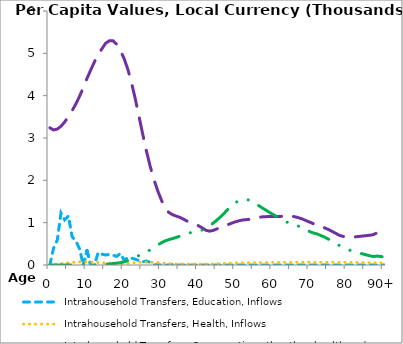
| Category | Intrahousehold Transfers, Education, Inflows | Intrahousehold Transfers, Health, Inflows | Intrahousehold Transfers, Consumption other than health and education, Inflows | Intrahousehold Transfers, Saving, Inflows |
|---|---|---|---|---|
| 0 | 0 | 0 | 3240.183 | 0 |
|  | 398.568 | 0 | 3190.546 | 0 |
| 2 | 589.279 | 17.185 | 3210.608 | 0 |
| 3 | 1228.678 | 32.034 | 3278.168 | 0 |
| 4 | 1067.011 | 43.698 | 3379.369 | 0 |
| 5 | 1159.666 | 52.711 | 3509.063 | 0 |
| 6 | 667.687 | 61.081 | 3647.013 | 0 |
| 7 | 567.62 | 68.461 | 3805.423 | 0 |
| 8 | 381.878 | 74.679 | 3984.844 | 0 |
| 9 | 0 | 78.019 | 4188.758 | 0 |
| 10 | 338.754 | 73.393 | 4408.093 | 0 |
| 11 | 0 | 67.792 | 4605.565 | 0.593 |
| 12 | 0 | 64.281 | 4798.766 | 4.177 |
| 13 | 294.288 | 59.221 | 4967.651 | 7.796 |
| 14 | 255.62 | 53.551 | 5105.435 | 11.478 |
| 15 | 236.878 | 48.256 | 5236.646 | 17.678 |
| 16 | 249.997 | 44.399 | 5295.285 | 25.417 |
| 17 | 230.655 | 40.732 | 5296.073 | 34.45 |
| 18 | 204.538 | 37.234 | 5214.381 | 43.744 |
| 19 | 272.016 | 35.946 | 5061.408 | 55.609 |
| 20 | 114.3 | 36.479 | 4875.232 | 75.746 |
| 21 | 173.171 | 40.791 | 4620.135 | 103.928 |
| 22 | 162.661 | 48.712 | 4299.49 | 139.117 |
| 23 | 137.656 | 56.892 | 3923.121 | 181.134 |
| 24 | 102.79 | 63.363 | 3511.034 | 225.829 |
| 25 | 71.088 | 66.055 | 3091.244 | 269.579 |
| 26 | 94.882 | 66.097 | 2692.379 | 310.72 |
| 27 | 60.508 | 65.006 | 2335.058 | 356.426 |
| 28 | 1.106 | 62.451 | 2024.441 | 410.749 |
| 29 | 11.4 | 57.857 | 1762.796 | 468.936 |
| 30 | 0 | 50.732 | 1538.939 | 523.926 |
| 31 | 0 | 42.04 | 1355.143 | 568.493 |
| 32 | 0 | 34.995 | 1242.11 | 597.828 |
| 33 | 9.634 | 30.434 | 1189.642 | 623.414 |
| 34 | 0 | 27.495 | 1156.168 | 651.304 |
| 35 | 0 | 25.983 | 1124.263 | 679.855 |
| 36 | 0 | 24.747 | 1081.108 | 708.552 |
| 37 | 1.085 | 23.305 | 1034.434 | 738.918 |
| 38 | 0 | 22.2 | 997.449 | 767.445 |
| 39 | 0 | 21.777 | 968.028 | 788.655 |
| 40 | 0 | 21.922 | 927.325 | 803.031 |
| 41 | 0 | 22.716 | 878.094 | 824.99 |
| 42 | 0 | 23.409 | 820.286 | 868.692 |
| 43 | 0 | 24.751 | 799.834 | 923.664 |
| 44 | 0 | 27.133 | 817.931 | 991.211 |
| 45 | 0 | 30.143 | 853.794 | 1062.618 |
| 46 | 0 | 33.889 | 887.219 | 1141.699 |
| 47 | 0 | 38.224 | 919.74 | 1228.305 |
| 48 | 0 | 42.214 | 954.859 | 1320.832 |
| 49 | 0 | 45.753 | 990.253 | 1413.773 |
| 50 | 0 | 48.394 | 1020.816 | 1475.17 |
| 51 | 0 | 49.86 | 1046.133 | 1522.225 |
| 52 | 0 | 50.777 | 1064.727 | 1552.755 |
| 53 | 0 | 51.67 | 1071.65 | 1547.207 |
| 54 | 0 | 52.762 | 1083.377 | 1524.01 |
| 55 | 0 | 54.574 | 1097.241 | 1478.7 |
| 56 | 0 | 56.9 | 1120.405 | 1415.497 |
| 57 | 0 | 58.919 | 1136.286 | 1357.679 |
| 58 | 0 | 59.587 | 1140.602 | 1306.095 |
| 59 | 0 | 60.189 | 1146 | 1249.606 |
| 60 | 0 | 61.057 | 1147.569 | 1197.689 |
| 61 | 0 | 61.723 | 1145.365 | 1146.876 |
| 62 | 0 | 62.498 | 1146.638 | 1094.902 |
| 63 | 0 | 63.342 | 1153.693 | 1045.944 |
| 64 | 0 | 63.795 | 1160.566 | 1006.568 |
| 65 | 0 | 63.909 | 1155.905 | 973.69 |
| 66 | 0 | 64.037 | 1138.39 | 946.497 |
| 67 | 0 | 64.516 | 1115.59 | 915.665 |
| 68 | 0 | 65.421 | 1085.7 | 884.632 |
| 69 | 0 | 65.657 | 1048.076 | 848.123 |
| 70 | 0 | 65.417 | 1011.384 | 786.554 |
| 71 | 0 | 64.961 | 973.218 | 754.866 |
| 72 | 0 | 63.792 | 936.907 | 732.867 |
| 73 | 0 | 63.537 | 909.253 | 693.777 |
| 74 | 0 | 63.771 | 876.435 | 656.959 |
| 75 | 0 | 63.79 | 838.327 | 611.138 |
| 76 | 0 | 63.74 | 794.002 | 564.794 |
| 77 | 0 | 63.616 | 746.331 | 513.153 |
| 78 | 0 | 63.39 | 699.373 | 455.88 |
| 79 | 0 | 63.516 | 673.951 | 410.776 |
| 80 | 0 | 63.157 | 660.583 | 373.699 |
| 81 | 0 | 62.08 | 656.968 | 340.251 |
| 82 | 0 | 60.387 | 661.025 | 314.14 |
| 83 | 0 | 58.294 | 673.002 | 290.216 |
| 84 | 0 | 56.318 | 681.832 | 266.592 |
| 85 | 0 | 54.468 | 691.669 | 243.268 |
| 86 | 0 | 52.777 | 702.494 | 221.242 |
| 87 | 0 | 51.251 | 714.314 | 201.157 |
| 88 | 0 | 49.353 | 754.424 | 211.479 |
| 89 | 0 | 48.155 | 773.281 | 201.851 |
| 90+ | 0 | 47.039 | 790.866 | 191.704 |